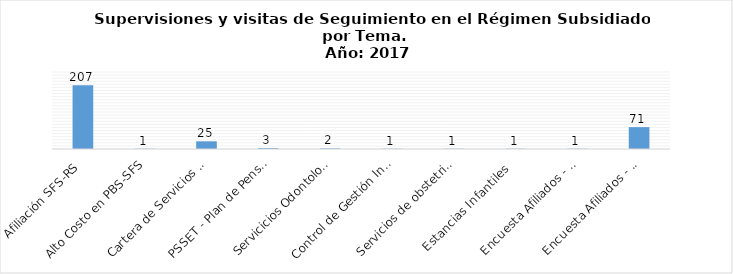
| Category | Total |
|---|---|
| Afiliación SFS-RS | 207 |
| Alto Costo en PBS-SFS | 1 |
| Cartera de Servicios de Salud | 25 |
| PSSET - Plan de Pensionado y  Jubilados del Ministerio de Hacienda | 3 |
| Servicicios Odontologicos  | 2 |
| Control de Gestión Interno - RS / Estancias Infantiles   | 1 |
| Servicios de obstetricia (II -III Nivel de Atención) | 1 |
| Estancias Infantiles  | 1 |
| Encuesta Afiliados - EI | 1 |
| Encuesta Afiliados - RS  | 71 |